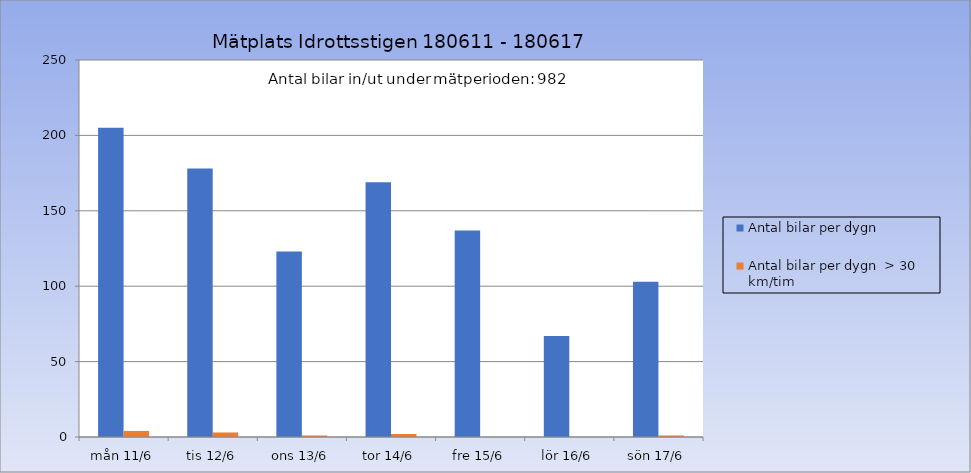
| Category | Antal bilar per dygn | Antal bilar per dygn  > 30 km/tim |
|---|---|---|
| mån 11/6 | 205 | 4 |
| tis 12/6 | 178 | 3 |
| ons 13/6 | 123 | 1 |
| tor 14/6 | 169 | 2 |
| fre 15/6 | 137 | 0 |
| lör 16/6 | 67 | 0 |
| sön 17/6 | 103 | 1 |